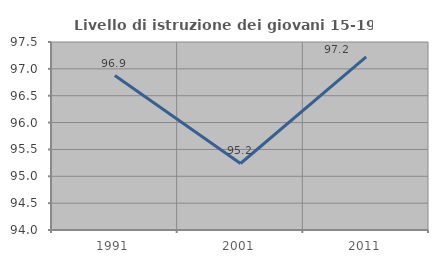
| Category | Livello di istruzione dei giovani 15-19 anni |
|---|---|
| 1991.0 | 96.875 |
| 2001.0 | 95.238 |
| 2011.0 | 97.222 |